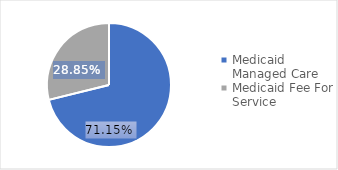
| Category | Series 0 |
|---|---|
| Medicaid Managed Care | 0.711 |
| Medicaid Fee For Service | 0.289 |